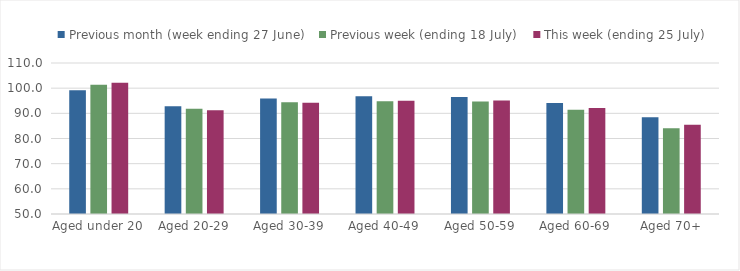
| Category | Previous month (week ending 27 June) | Previous week (ending 18 July) | This week (ending 25 July) |
|---|---|---|---|
| Aged under 20 | 99.14 | 101.364 | 102.175 |
| Aged 20-29 | 92.817 | 91.804 | 91.238 |
| Aged 30-39 | 95.887 | 94.364 | 94.231 |
| Aged 40-49 | 96.748 | 94.789 | 94.979 |
| Aged 50-59 | 96.505 | 94.746 | 95.058 |
| Aged 60-69 | 94.133 | 91.392 | 92.084 |
| Aged 70+ | 88.453 | 84.033 | 85.44 |